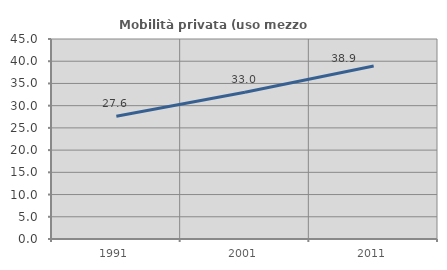
| Category | Mobilità privata (uso mezzo privato) |
|---|---|
| 1991.0 | 27.602 |
| 2001.0 | 33.014 |
| 2011.0 | 38.942 |